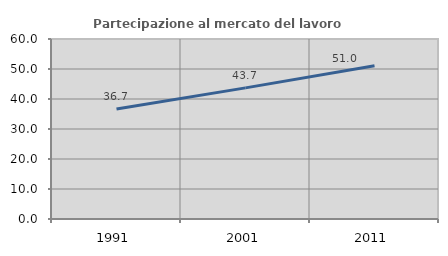
| Category | Partecipazione al mercato del lavoro  femminile |
|---|---|
| 1991.0 | 36.667 |
| 2001.0 | 43.702 |
| 2011.0 | 51.049 |